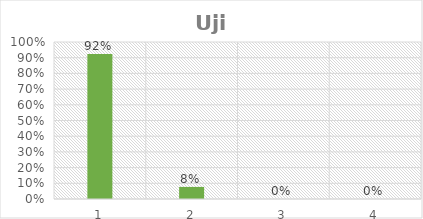
| Category | Series 0 |
|---|---|
| 0 | 0.923 |
| 1 | 0.077 |
| 2 | 0 |
| 3 | 0 |